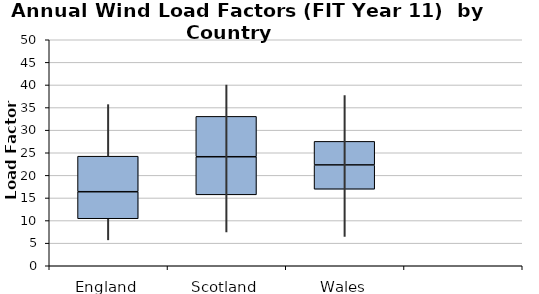
| Category | Series 0 | Series 1 | Series 2 |
|---|---|---|---|
| 0 | 10.4 | 5.98 | 7.86 |
| 1 | 15.69 | 8.43 | 8.93 |
| 2 | 16.93 | 5.38 | 5.21 |